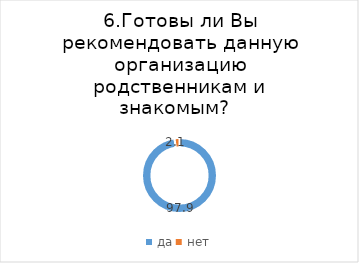
| Category | Series 0 |
|---|---|
| да | 97.872 |
| нет | 2.128 |